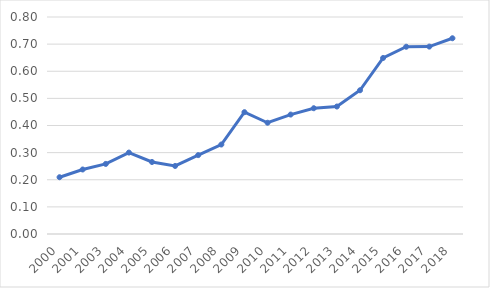
| Category | Series 0 |
|---|---|
| 2000.0 | 0.209 |
| 2001.0 | 0.238 |
| 2003.0 | 0.258 |
| 2004.0 | 0.3 |
| 2005.0 | 0.265 |
| 2006.0 | 0.251 |
| 2007.0 | 0.291 |
| 2008.0 | 0.33 |
| 2009.0 | 0.449 |
| 2010.0 | 0.41 |
| 2011.0 | 0.44 |
| 2012.0 | 0.464 |
| 2013.0 | 0.47 |
| 2014.0 | 0.53 |
| 2015.0 | 0.649 |
| 2016.0 | 0.69 |
| 2017.0 | 0.691 |
| 2018.0 | 0.722 |